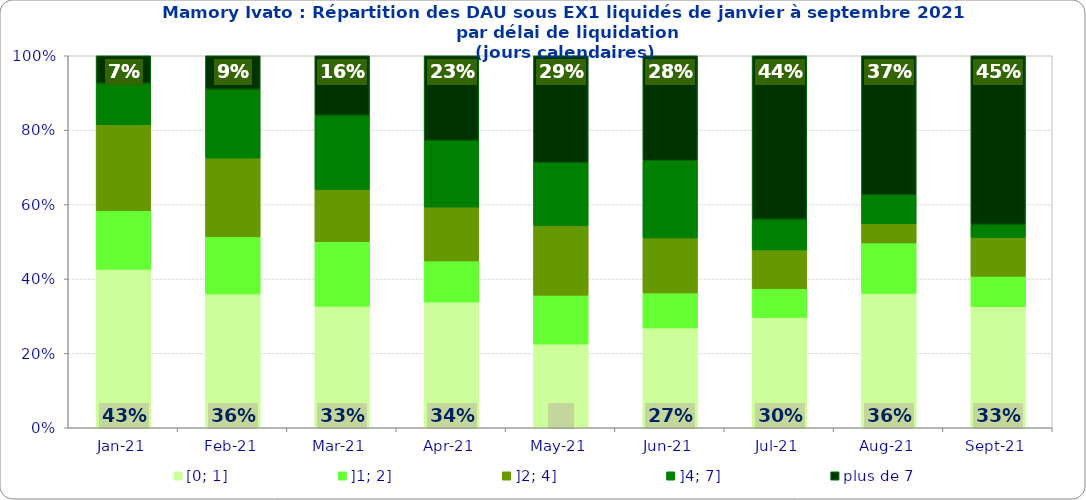
| Category | [0; 1] | ]1; 2] | ]2; 4] | ]4; 7] | plus de 7 |
|---|---|---|---|---|---|
| 2021-01-01 | 0.426 | 0.157 | 0.231 | 0.111 | 0.074 |
| 2021-02-01 | 0.36 | 0.153 | 0.212 | 0.185 | 0.09 |
| 2021-03-01 | 0.327 | 0.173 | 0.14 | 0.2 | 0.16 |
| 2021-04-01 | 0.338 | 0.11 | 0.145 | 0.179 | 0.228 |
| 2021-05-01 | 0.225 | 0.131 | 0.188 | 0.169 | 0.288 |
| 2021-06-01 | 0.268 | 0.094 | 0.148 | 0.208 | 0.282 |
| 2021-07-01 | 0.297 | 0.077 | 0.104 | 0.082 | 0.44 |
| 2021-08-01 | 0.361 | 0.135 | 0.052 | 0.077 | 0.374 |
| 2021-09-01 | 0.326 | 0.081 | 0.105 | 0.035 | 0.453 |